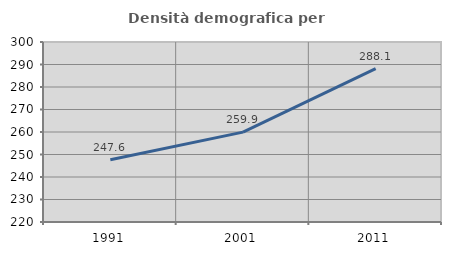
| Category | Densità demografica |
|---|---|
| 1991.0 | 247.634 |
| 2001.0 | 259.943 |
| 2011.0 | 288.128 |